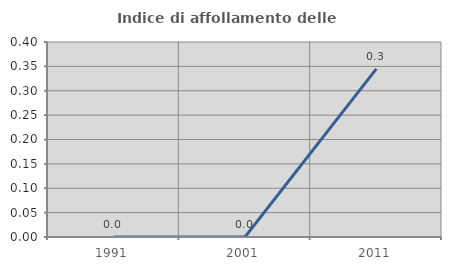
| Category | Indice di affollamento delle abitazioni  |
|---|---|
| 1991.0 | 0 |
| 2001.0 | 0 |
| 2011.0 | 0.345 |